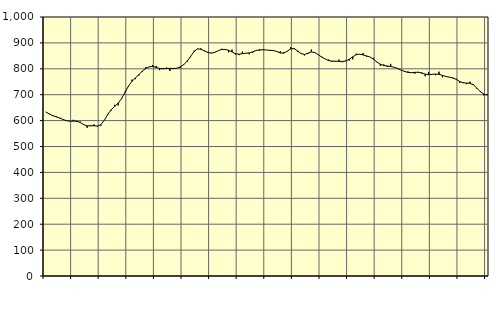
| Category | Piggar | Series 1 |
|---|---|---|
| nan | 633.6 | 633.08 |
| 87.0 | 627.7 | 626 |
| 87.0 | 617.1 | 619.41 |
| 87.0 | 617.8 | 614.75 |
| nan | 609 | 610.29 |
| 88.0 | 605.6 | 604.32 |
| 88.0 | 599.4 | 599.57 |
| 88.0 | 598.3 | 597.74 |
| nan | 603 | 598.11 |
| 89.0 | 594.3 | 597.67 |
| 89.0 | 596 | 592.61 |
| 89.0 | 582.9 | 584.55 |
| nan | 572.2 | 579.69 |
| 90.0 | 583.1 | 580.03 |
| 90.0 | 585.5 | 580.15 |
| 90.0 | 576.5 | 578.68 |
| nan | 580.4 | 584.49 |
| 91.0 | 601.8 | 601.72 |
| 91.0 | 626 | 624.06 |
| 91.0 | 639.4 | 642.55 |
| nan | 660.9 | 654.74 |
| 92.0 | 658.7 | 667.22 |
| 92.0 | 683.1 | 685.25 |
| 92.0 | 712.5 | 709.42 |
| nan | 731.7 | 733.52 |
| 93.0 | 758.1 | 751.6 |
| 93.0 | 759.9 | 765.16 |
| 93.0 | 774.2 | 777.89 |
| nan | 788.5 | 790.82 |
| 94.0 | 806.3 | 801.35 |
| 94.0 | 806.6 | 807.58 |
| 94.0 | 814.7 | 808.75 |
| nan | 811.2 | 805.51 |
| 95.0 | 794.8 | 801.41 |
| 95.0 | 802.3 | 800.06 |
| 95.0 | 805.5 | 801.14 |
| nan | 791.5 | 801.71 |
| 96.0 | 803 | 801.02 |
| 96.0 | 801.8 | 802.18 |
| 96.0 | 802.5 | 807.28 |
| nan | 817.5 | 815.88 |
| 97.0 | 826.6 | 829.72 |
| 97.0 | 845 | 848.08 |
| 97.0 | 870 | 866.78 |
| nan | 878.3 | 876.9 |
| 98.0 | 878.9 | 875.38 |
| 98.0 | 870.4 | 868.76 |
| 98.0 | 865.3 | 863.02 |
| nan | 859.4 | 860.53 |
| 99.0 | 864.9 | 863.41 |
| 99.0 | 870 | 869.89 |
| 99.0 | 877.4 | 874.47 |
| nan | 875.5 | 874.83 |
| 0.0 | 863.4 | 871.5 |
| 0.0 | 874 | 865 |
| 0.0 | 854.8 | 858.27 |
| nan | 852.7 | 856.4 |
| 1.0 | 866.2 | 858.5 |
| 1.0 | 859.7 | 860.11 |
| 1.0 | 856 | 861.25 |
| nan | 862.1 | 865.33 |
| 2.0 | 872 | 870.74 |
| 2.0 | 869.7 | 873.3 |
| 2.0 | 874.6 | 873.3 |
| nan | 872.5 | 872.59 |
| 3.0 | 870 | 871.37 |
| 3.0 | 871.6 | 870.4 |
| 3.0 | 865.4 | 866.84 |
| nan | 867.6 | 861.12 |
| 4.0 | 864.2 | 860.48 |
| 4.0 | 866.7 | 867.82 |
| 4.0 | 883.8 | 876.99 |
| nan | 879.9 | 878.01 |
| 5.0 | 866.3 | 869.28 |
| 5.0 | 858.5 | 858.87 |
| 5.0 | 851.5 | 855.37 |
| nan | 857 | 860.04 |
| 6.0 | 874.3 | 864.96 |
| 6.0 | 862.1 | 862.83 |
| 6.0 | 854.8 | 854.29 |
| nan | 847 | 845.28 |
| 7.0 | 837.7 | 837.86 |
| 7.0 | 835.7 | 832.16 |
| 7.0 | 826.5 | 829.5 |
| nan | 827.4 | 829.2 |
| 8.0 | 835.6 | 828.85 |
| 8.0 | 825.5 | 828.13 |
| 8.0 | 831.8 | 830.08 |
| nan | 831.9 | 836.6 |
| 9.0 | 836.5 | 846.45 |
| 9.0 | 858.6 | 854.4 |
| 9.0 | 856.6 | 856.64 |
| nan | 860.8 | 853.58 |
| 10.0 | 846.9 | 849.75 |
| 10.0 | 845.6 | 845.57 |
| 10.0 | 842.3 | 837.4 |
| nan | 825.3 | 826.29 |
| 11.0 | 811.4 | 817.49 |
| 11.0 | 816.9 | 812.82 |
| 11.0 | 806.9 | 810.87 |
| nan | 819 | 809.03 |
| 12.0 | 806.4 | 806.18 |
| 12.0 | 803.2 | 801.28 |
| 12.0 | 795.4 | 794.97 |
| nan | 788.4 | 790.11 |
| 13.0 | 790 | 786.11 |
| 13.0 | 783.9 | 784.87 |
| 13.0 | 780.7 | 786.41 |
| nan | 788.3 | 786.48 |
| 14.0 | 786.3 | 783.31 |
| 14.0 | 771 | 779.37 |
| 14.0 | 787.6 | 777.61 |
| nan | 779 | 778.57 |
| 15.0 | 775.1 | 779.63 |
| 15.0 | 788.9 | 778.49 |
| 15.0 | 767.2 | 774.84 |
| nan | 770.7 | 770.18 |
| 16.0 | 767.3 | 767.97 |
| 16.0 | 763.2 | 765.22 |
| 16.0 | 761.5 | 759.12 |
| nan | 746.1 | 751.29 |
| 17.0 | 748.2 | 745.9 |
| 17.0 | 740.7 | 745.06 |
| 17.0 | 750.4 | 744.05 |
| nan | 740.4 | 737.86 |
| 18.0 | 723.1 | 725.34 |
| 18.0 | 714.3 | 711.55 |
| 18.0 | 697.1 | 702.7 |
| nan | 702.6 | 698.24 |